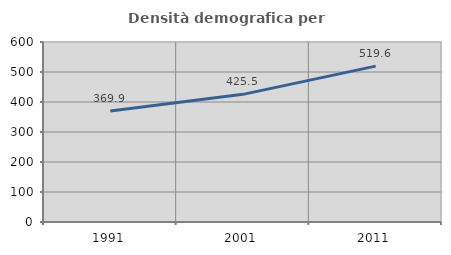
| Category | Densità demografica |
|---|---|
| 1991.0 | 369.857 |
| 2001.0 | 425.46 |
| 2011.0 | 519.575 |